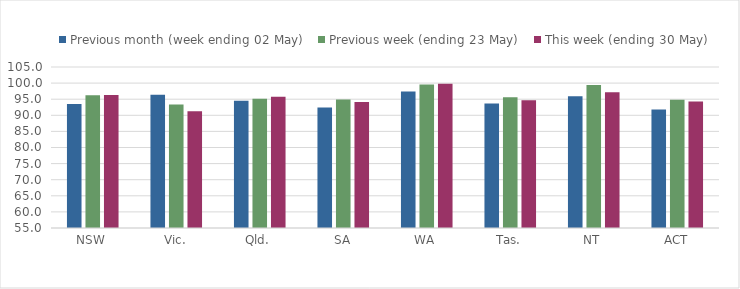
| Category | Previous month (week ending 02 May) | Previous week (ending 23 May) | This week (ending 30 May) |
|---|---|---|---|
| NSW | 93.488 | 96.242 | 96.289 |
| Vic. | 96.4 | 93.347 | 91.295 |
| Qld. | 94.505 | 95.17 | 95.777 |
| SA | 92.451 | 94.912 | 94.092 |
| WA | 97.409 | 99.544 | 99.766 |
| Tas. | 93.664 | 95.62 | 94.698 |
| NT | 95.903 | 99.444 | 97.142 |
| ACT | 91.803 | 94.824 | 94.254 |